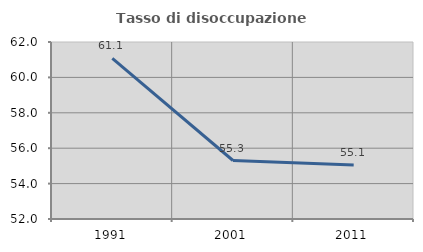
| Category | Tasso di disoccupazione giovanile  |
|---|---|
| 1991.0 | 61.076 |
| 2001.0 | 55.305 |
| 2011.0 | 55.052 |